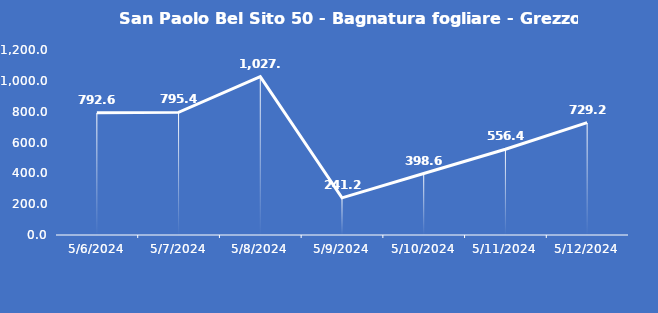
| Category | San Paolo Bel Sito 50 - Bagnatura fogliare - Grezzo (min) |
|---|---|
| 5/6/24 | 792.6 |
| 5/7/24 | 795.4 |
| 5/8/24 | 1027 |
| 5/9/24 | 241.2 |
| 5/10/24 | 398.6 |
| 5/11/24 | 556.4 |
| 5/12/24 | 729.2 |